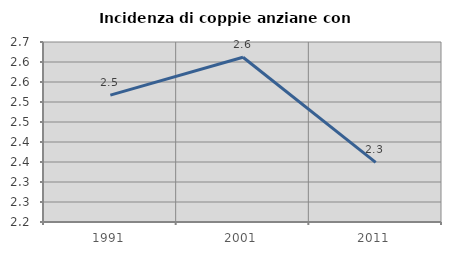
| Category | Incidenza di coppie anziane con figli |
|---|---|
| 1991.0 | 2.517 |
| 2001.0 | 2.612 |
| 2011.0 | 2.349 |